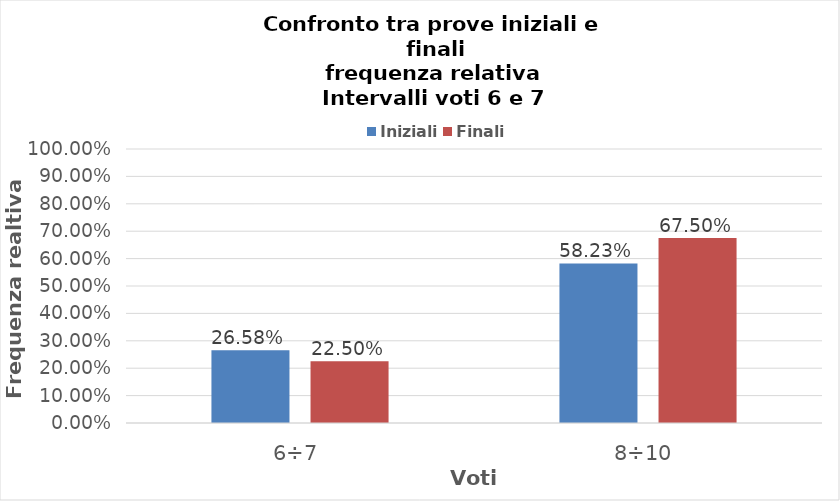
| Category | Iniziali | Finali |
|---|---|---|
| 6÷7 | 0.266 | 0.225 |
| 8÷10 | 0.582 | 0.675 |